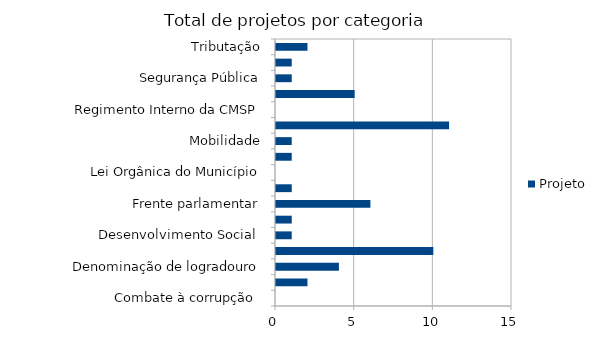
| Category | Projeto |
|---|---|
| Combate à corrupção  | 0 |
| Datas comemorativas e homenagens diversas | 2 |
| Denominação de logradouro | 4 |
| Desenvolvimento Econômico | 10 |
| Desenvolvimento Social  | 1 |
| Educação e cultura | 1 |
| Frente parlamentar | 6 |
| Habitação e Urbanismo | 1 |
| Lei Orgânica do Município | 0 |
| Meio ambiente ,  | 1 |
| Mobilidade | 1 |
| Proteção dos animais | 11 |
| Regimento Interno da CMSP | 0 |
| Saude-Esporte | 5 |
| Segurança Pública | 1 |
| Transparencia | 1 |
| Tributação | 2 |